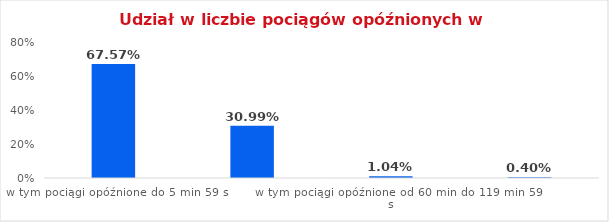
| Category | Series 0 |
|---|---|
| w tym pociągi opóźnione do 5 min 59 s | 0.676 |
| w tym pociągi opóźnione od 6 min do 59 min 59 s | 0.31 |
| w tym pociągi opóźnione od 60 min do 119 min 59 s | 0.01 |
| w tym pociągi opóźnione od 120 min | 0.004 |